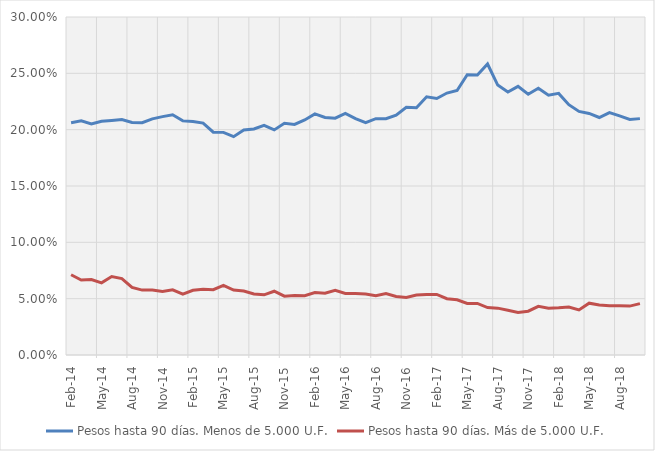
| Category | Pesos hasta 90 días. Menos de 5.000 U.F. | Pesos hasta 90 días. Más de 5.000 U.F. |
|---|---|---|
| 2014-02-01 | 0.206 | 0.071 |
| 2014-03-01 | 0.208 | 0.067 |
| 2014-04-01 | 0.205 | 0.067 |
| 2014-05-01 | 0.207 | 0.064 |
| 2014-06-01 | 0.208 | 0.07 |
| 2014-07-01 | 0.209 | 0.068 |
| 2014-08-01 | 0.206 | 0.06 |
| 2014-09-01 | 0.206 | 0.058 |
| 2014-10-01 | 0.21 | 0.058 |
| 2014-11-01 | 0.212 | 0.056 |
| 2014-12-01 | 0.213 | 0.058 |
| 2015-01-01 | 0.208 | 0.054 |
| 2015-02-01 | 0.207 | 0.057 |
| 2015-03-01 | 0.206 | 0.058 |
| 2015-04-01 | 0.198 | 0.058 |
| 2015-05-01 | 0.198 | 0.062 |
| 2015-06-01 | 0.194 | 0.058 |
| 2015-07-01 | 0.2 | 0.057 |
| 2015-08-01 | 0.201 | 0.054 |
| 2015-09-01 | 0.204 | 0.053 |
| 2015-10-01 | 0.2 | 0.057 |
| 2015-11-01 | 0.206 | 0.052 |
| 2015-12-01 | 0.205 | 0.053 |
| 2016-01-01 | 0.209 | 0.053 |
| 2016-02-01 | 0.214 | 0.055 |
| 2016-03-01 | 0.211 | 0.055 |
| 2016-04-01 | 0.21 | 0.057 |
| 2016-05-01 | 0.214 | 0.055 |
| 2016-06-01 | 0.21 | 0.055 |
| 2016-07-01 | 0.206 | 0.054 |
| 2016-08-01 | 0.21 | 0.053 |
| 2016-09-01 | 0.21 | 0.055 |
| 2016-10-01 | 0.213 | 0.052 |
| 2016-11-01 | 0.22 | 0.051 |
| 2016-12-01 | 0.219 | 0.053 |
| 2017-01-01 | 0.229 | 0.054 |
| 2017-02-01 | 0.228 | 0.054 |
| 2017-03-01 | 0.232 | 0.05 |
| 2017-04-01 | 0.235 | 0.049 |
| 2017-05-01 | 0.249 | 0.046 |
| 2017-06-01 | 0.249 | 0.046 |
| 2017-07-01 | 0.258 | 0.042 |
| 2017-08-01 | 0.24 | 0.042 |
| 2017-09-01 | 0.233 | 0.04 |
| 2017-10-01 | 0.238 | 0.038 |
| 2017-11-01 | 0.231 | 0.039 |
| 2017-12-01 | 0.237 | 0.043 |
| 2018-01-01 | 0.231 | 0.042 |
| 2018-02-01 | 0.232 | 0.042 |
| 2018-03-01 | 0.222 | 0.043 |
| 2018-04-01 | 0.216 | 0.04 |
| 2018-05-01 | 0.214 | 0.046 |
| 2018-06-01 | 0.211 | 0.044 |
| 2018-07-01 | 0.215 | 0.044 |
| 2018-08-01 | 0.212 | 0.044 |
| 2018-09-01 | 0.209 | 0.043 |
| 2018-10-01 | 0.21 | 0.046 |